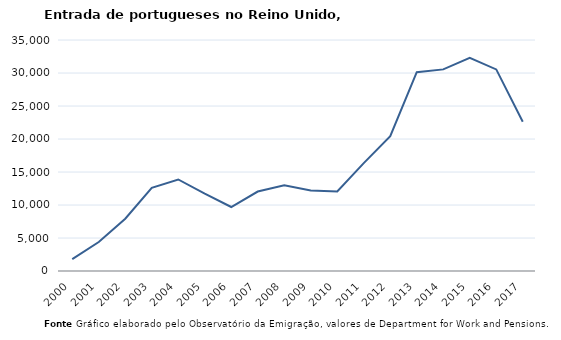
| Category | Entradas |
|---|---|
| 2000.0 | 1811 |
| 2001.0 | 4396 |
| 2002.0 | 7915 |
| 2003.0 | 12603 |
| 2004.0 | 13867 |
| 2005.0 | 11712 |
| 2006.0 | 9696 |
| 2007.0 | 12039 |
| 2008.0 | 12983 |
| 2009.0 | 12211 |
| 2010.0 | 12064 |
| 2011.0 | 16347 |
| 2012.0 | 20443 |
| 2013.0 | 30121 |
| 2014.0 | 30546 |
| 2015.0 | 32301 |
| 2016.0 | 30543 |
| 2017.0 | 22622 |